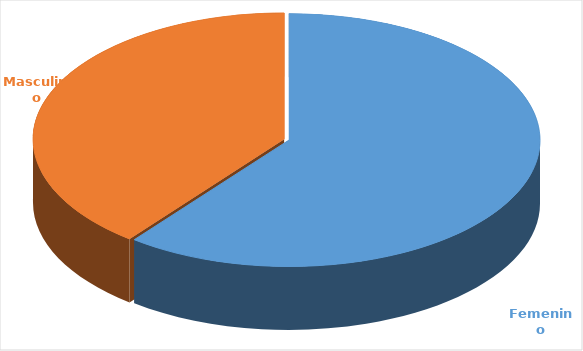
| Category | Cantidad  |
|---|---|
| Femenino | 3807 |
| Masculino | 2480 |